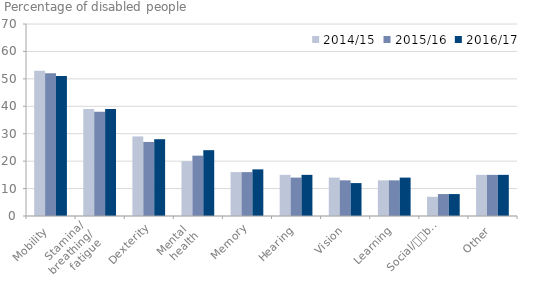
| Category | 2014/15 | 2015/16 | 2016/17 |
|---|---|---|---|
| Mobility | 53 | 52 | 51 |
| Stamina/
breathing/
fatigue | 39 | 38 | 39 |
| Dexterity | 29 | 27 | 28 |
| Mental 
health | 20 | 22 | 24 |
| Memory | 16 | 16 | 17 |
| Hearing | 15 | 14 | 15 |
| Vision | 14 | 13 | 12 |
| Learning | 13 | 13 | 14 |
| Social/
behavioural | 7 | 8 | 8 |
| Other | 15 | 15 | 15 |